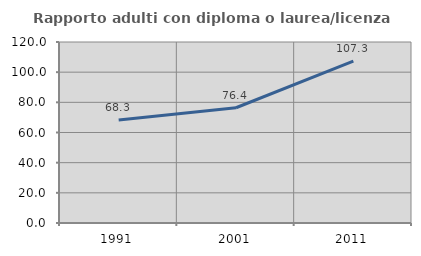
| Category | Rapporto adulti con diploma o laurea/licenza media  |
|---|---|
| 1991.0 | 68.308 |
| 2001.0 | 76.399 |
| 2011.0 | 107.317 |